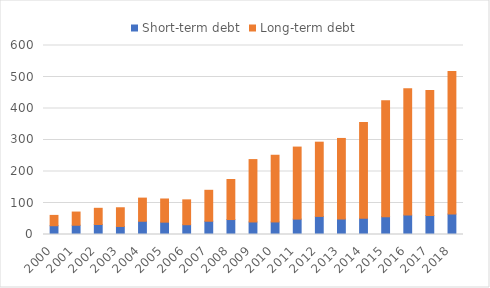
| Category | Short-term debt | Long-term debt |
|---|---|---|
| 2000.0 | 27.891 | 32.742 |
| 2001.0 | 29.372 | 41.895 |
| 2002.0 | 31.756 | 51.414 |
| 2003.0 | 25.515 | 59.376 |
| 2004.0 | 42.014 | 73.51 |
| 2005.0 | 39.144 | 73.588 |
| 2006.0 | 31.081 | 78.89 |
| 2007.0 | 42.1 | 98.249 |
| 2008.0 | 47.517 | 127.013 |
| 2009.0 | 39.766 | 198.071 |
| 2010.0 | 39.842 | 211.747 |
| 2011.0 | 48.877 | 228.658 |
| 2012.0 | 57.468 | 235.637 |
| 2013.0 | 49.196 | 255.749 |
| 2014.0 | 51.417 | 303.772 |
| 2015.0 | 56.737 | 367.737 |
| 2016.0 | 61.523 | 401.389 |
| 2017.0 | 60.152 | 397.247 |
| 2018.0 | 64.848 | 452.774 |